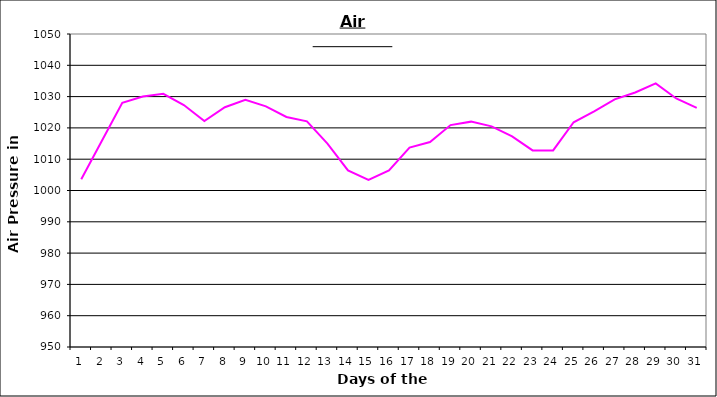
| Category | Series 0 |
|---|---|
| 0 | 1003.6 |
| 1 | 1015.8 |
| 2 | 1028 |
| 3 | 1030 |
| 4 | 1030.9 |
| 5 | 1027.3 |
| 6 | 1022.2 |
| 7 | 1026.6 |
| 8 | 1029 |
| 9 | 1026.9 |
| 10 | 1023.5 |
| 11 | 1022.1 |
| 12 | 1015 |
| 13 | 1006.4 |
| 14 | 1003.4 |
| 15 | 1006.4 |
| 16 | 1013.7 |
| 17 | 1015.5 |
| 18 | 1020.9 |
| 19 | 1022 |
| 20 | 1020.5 |
| 21 | 1017.3 |
| 22 | 1012.8 |
| 23 | 1012.8 |
| 24 | 1021.8 |
| 25 | 1025.3 |
| 26 | 1029.1 |
| 27 | 1031.3 |
| 28 | 1034.2 |
| 29 | 1029.4 |
| 30 | 1026.4 |